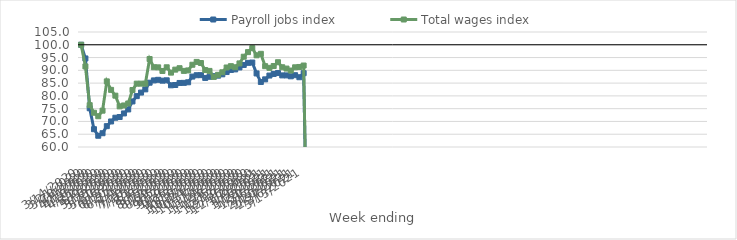
| Category | Payroll jobs index | Total wages index |
|---|---|---|
| 14/03/2020 | 100 | 100 |
| 21/03/2020 | 94.654 | 91.529 |
| 28/03/2020 | 75.161 | 76.378 |
| 04/04/2020 | 66.968 | 73.407 |
| 11/04/2020 | 64.408 | 72.034 |
| 18/04/2020 | 65.387 | 74.221 |
| 25/04/2020 | 68.156 | 85.677 |
| 02/05/2020 | 69.993 | 82.355 |
| 09/05/2020 | 71.457 | 80.086 |
| 16/05/2020 | 71.737 | 75.899 |
| 23/05/2020 | 73.138 | 76.256 |
| 30/05/2020 | 74.697 | 77.031 |
| 06/06/2020 | 77.831 | 82.31 |
| 13/06/2020 | 79.904 | 84.789 |
| 20/06/2020 | 81.296 | 84.791 |
| 27/06/2020 | 82.551 | 84.79 |
| 04/07/2020 | 85.164 | 94.43 |
| 11/07/2020 | 86.06 | 91.213 |
| 18/07/2020 | 86.287 | 91.167 |
| 25/07/2020 | 85.958 | 89.748 |
| 01/08/2020 | 86.096 | 91.192 |
| 08/08/2020 | 84.137 | 89.098 |
| 15/08/2020 | 84.258 | 90.273 |
| 22/08/2020 | 85.057 | 90.834 |
| 29/08/2020 | 85.093 | 89.782 |
| 05/09/2020 | 85.319 | 89.965 |
| 12/09/2020 | 87.552 | 92.187 |
| 19/09/2020 | 88.091 | 93.296 |
| 26/09/2020 | 88.116 | 92.858 |
| 03/10/2020 | 87.021 | 90.116 |
| 10/10/2020 | 87.474 | 89.776 |
| 17/10/2020 | 87.723 | 87.429 |
| 24/10/2020 | 87.916 | 88.237 |
| 31/10/2020 | 88.443 | 89.232 |
| 07/11/2020 | 89.332 | 91.114 |
| 14/11/2020 | 90.144 | 91.629 |
| 21/11/2020 | 90.364 | 91.204 |
| 28/11/2020 | 91.123 | 92.71 |
| 05/12/2020 | 92.102 | 95.326 |
| 12/12/2020 | 92.925 | 97.13 |
| 19/12/2020 | 93.05 | 98.682 |
| 26/12/2020 | 88.784 | 95.879 |
| 02/01/2021 | 85.452 | 96.46 |
| 09/01/2021 | 86.469 | 91.632 |
| 16/01/2021 | 87.954 | 90.97 |
| 23/01/2021 | 88.579 | 91.698 |
| 30/01/2021 | 88.941 | 93.172 |
| 06/02/2021 | 88.02 | 91.21 |
| 13/02/2021 | 88.018 | 90.69 |
| 20/02/2021 | 87.658 | 89.922 |
| 27/02/2021 | 88.1 | 91.188 |
| 06/03/2021 | 87.305 | 91.315 |
| 13/03/2021 | 88.887 | 91.879 |